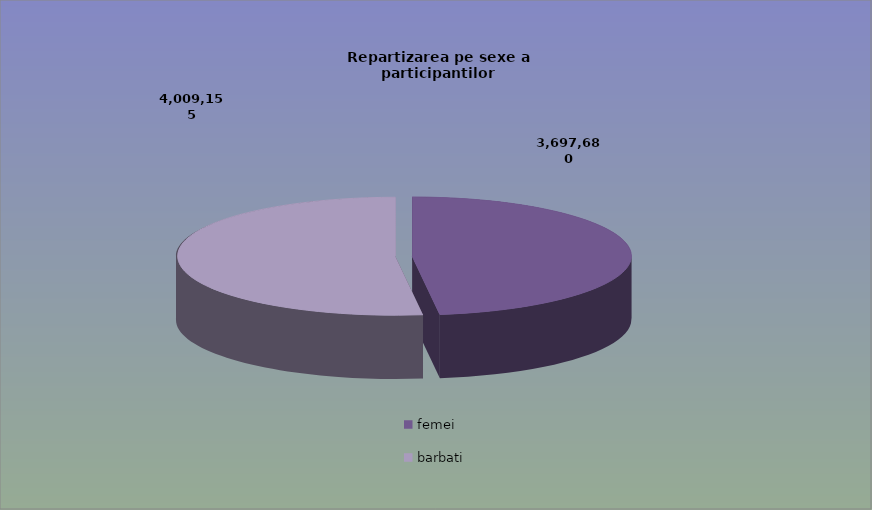
| Category | Series 0 |
|---|---|
| femei | 3697680 |
| barbati | 4009155 |